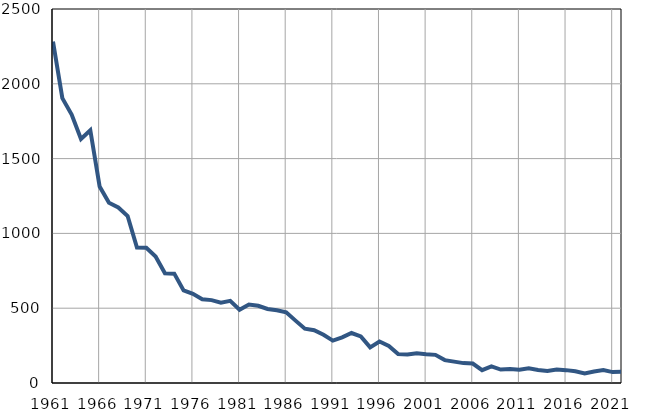
| Category | Умрла 
одојчад |
|---|---|
| 1961.0 | 2282 |
| 1962.0 | 1904 |
| 1963.0 | 1794 |
| 1964.0 | 1631 |
| 1965.0 | 1690 |
| 1966.0 | 1313 |
| 1967.0 | 1205 |
| 1968.0 | 1173 |
| 1969.0 | 1116 |
| 1970.0 | 906 |
| 1971.0 | 904 |
| 1972.0 | 846 |
| 1973.0 | 734 |
| 1974.0 | 731 |
| 1975.0 | 619 |
| 1976.0 | 596 |
| 1977.0 | 560 |
| 1978.0 | 554 |
| 1979.0 | 537 |
| 1980.0 | 549 |
| 1981.0 | 490 |
| 1982.0 | 525 |
| 1983.0 | 516 |
| 1984.0 | 495 |
| 1985.0 | 486 |
| 1986.0 | 473 |
| 1987.0 | 417 |
| 1988.0 | 363 |
| 1989.0 | 353 |
| 1990.0 | 322 |
| 1991.0 | 283 |
| 1992.0 | 305 |
| 1993.0 | 334 |
| 1994.0 | 311 |
| 1995.0 | 238 |
| 1996.0 | 277 |
| 1997.0 | 247 |
| 1998.0 | 193 |
| 1999.0 | 190 |
| 2000.0 | 198 |
| 2001.0 | 192 |
| 2002.0 | 188 |
| 2003.0 | 153 |
| 2004.0 | 143 |
| 2005.0 | 133 |
| 2006.0 | 130 |
| 2007.0 | 86 |
| 2008.0 | 111 |
| 2009.0 | 90 |
| 2010.0 | 94 |
| 2011.0 | 89 |
| 2012.0 | 99 |
| 2013.0 | 87 |
| 2014.0 | 81 |
| 2015.0 | 90 |
| 2016.0 | 86 |
| 2017.0 | 78 |
| 2018.0 | 64 |
| 2019.0 | 77 |
| 2020.0 | 87 |
| 2021.0 | 73 |
| 2022.0 | 75 |